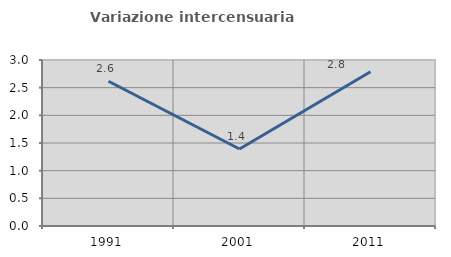
| Category | Variazione intercensuaria annua |
|---|---|
| 1991.0 | 2.615 |
| 2001.0 | 1.392 |
| 2011.0 | 2.788 |